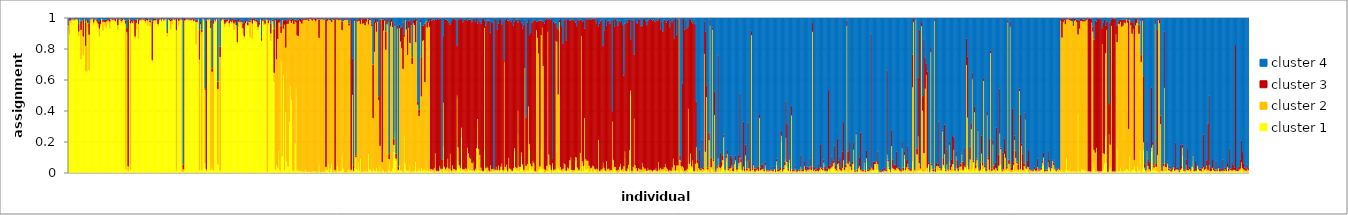
| Category | cluster 1 | cluster 2 | cluster 3 | cluster 4 |
|---|---|---|---|---|
| 0 | 0.914 | 0.038 | 0.013 | 0.035 |
| 1 | 0.891 | 0.092 | 0.009 | 0.009 |
| 2 | 0.964 | 0.019 | 0.009 | 0.009 |
| 3 | 0.982 | 0.007 | 0.005 | 0.005 |
| 4 | 0.982 | 0.01 | 0.004 | 0.004 |
| 5 | 0.982 | 0.006 | 0.006 | 0.006 |
| 6 | 0.981 | 0.009 | 0.006 | 0.004 |
| 7 | 0.987 | 0.004 | 0.005 | 0.004 |
| 8 | 0.982 | 0.009 | 0.005 | 0.004 |
| 9 | 0.882 | 0.029 | 0.049 | 0.04 |
| 10 | 0.984 | 0.007 | 0.005 | 0.004 |
| 11 | 0.731 | 0.19 | 0.058 | 0.021 |
| 12 | 0.973 | 0.012 | 0.007 | 0.009 |
| 13 | 0.757 | 0.122 | 0.106 | 0.015 |
| 14 | 0.976 | 0.016 | 0.003 | 0.005 |
| 15 | 0.658 | 0.161 | 0.15 | 0.032 |
| 16 | 0.651 | 0.332 | 0.008 | 0.01 |
| 17 | 0.934 | 0.032 | 0.026 | 0.008 |
| 18 | 0.659 | 0.231 | 0.075 | 0.035 |
| 19 | 0.961 | 0.03 | 0.005 | 0.005 |
| 20 | 0.984 | 0.007 | 0.004 | 0.004 |
| 21 | 0.983 | 0.01 | 0.004 | 0.003 |
| 22 | 0.955 | 0.015 | 0.017 | 0.012 |
| 23 | 0.98 | 0.007 | 0.008 | 0.006 |
| 24 | 0.986 | 0.007 | 0.004 | 0.003 |
| 25 | 0.966 | 0.01 | 0.016 | 0.008 |
| 26 | 0.938 | 0.024 | 0.017 | 0.021 |
| 27 | 0.879 | 0.05 | 0.047 | 0.024 |
| 28 | 0.944 | 0.017 | 0.025 | 0.014 |
| 29 | 0.988 | 0.005 | 0.004 | 0.003 |
| 30 | 0.916 | 0.058 | 0.011 | 0.015 |
| 31 | 0.965 | 0.009 | 0.011 | 0.015 |
| 32 | 0.947 | 0.024 | 0.017 | 0.012 |
| 33 | 0.934 | 0.044 | 0.009 | 0.013 |
| 34 | 0.97 | 0.013 | 0.008 | 0.009 |
| 35 | 0.97 | 0.013 | 0.008 | 0.009 |
| 36 | 0.929 | 0.047 | 0.015 | 0.009 |
| 37 | 0.988 | 0.005 | 0.004 | 0.003 |
| 38 | 0.974 | 0.014 | 0.008 | 0.004 |
| 39 | 0.98 | 0.008 | 0.006 | 0.005 |
| 40 | 0.98 | 0.008 | 0.007 | 0.005 |
| 41 | 0.971 | 0.009 | 0.012 | 0.007 |
| 42 | 0.987 | 0.006 | 0.004 | 0.003 |
| 43 | 0.922 | 0.029 | 0.042 | 0.008 |
| 44 | 0.984 | 0.005 | 0.006 | 0.006 |
| 45 | 0.984 | 0.007 | 0.005 | 0.004 |
| 46 | 0.965 | 0.013 | 0.011 | 0.011 |
| 47 | 0.972 | 0.012 | 0.011 | 0.005 |
| 48 | 0.986 | 0.006 | 0.004 | 0.003 |
| 49 | 0.974 | 0.013 | 0.009 | 0.004 |
| 50 | 0.02 | 0.941 | 0.021 | 0.018 |
| 51 | 0.887 | 0.019 | 0.028 | 0.066 |
| 52 | 0.01 | 0.03 | 0.95 | 0.01 |
| 53 | 0.984 | 0.008 | 0.004 | 0.004 |
| 54 | 0.02 | 0.944 | 0.017 | 0.019 |
| 55 | 0.967 | 0.009 | 0.013 | 0.012 |
| 56 | 0.959 | 0.008 | 0.011 | 0.022 |
| 57 | 0.975 | 0.006 | 0.013 | 0.006 |
| 58 | 0.866 | 0.013 | 0.11 | 0.012 |
| 59 | 0.926 | 0.04 | 0.02 | 0.014 |
| 60 | 0.986 | 0.004 | 0.004 | 0.006 |
| 61 | 0.862 | 0.097 | 0.028 | 0.014 |
| 62 | 0.98 | 0.006 | 0.009 | 0.005 |
| 63 | 0.977 | 0.01 | 0.01 | 0.003 |
| 64 | 0.984 | 0.005 | 0.004 | 0.006 |
| 65 | 0.983 | 0.006 | 0.006 | 0.006 |
| 66 | 0.979 | 0.01 | 0.006 | 0.006 |
| 67 | 0.964 | 0.015 | 0.011 | 0.01 |
| 68 | 0.982 | 0.005 | 0.007 | 0.006 |
| 69 | 0.948 | 0.034 | 0.011 | 0.007 |
| 70 | 0.985 | 0.005 | 0.005 | 0.004 |
| 71 | 0.944 | 0.026 | 0.013 | 0.017 |
| 72 | 0.98 | 0.01 | 0.005 | 0.005 |
| 73 | 0.714 | 0.013 | 0.25 | 0.024 |
| 74 | 0.966 | 0.017 | 0.012 | 0.005 |
| 75 | 0.978 | 0.007 | 0.009 | 0.007 |
| 76 | 0.974 | 0.011 | 0.009 | 0.006 |
| 77 | 0.979 | 0.011 | 0.005 | 0.004 |
| 78 | 0.945 | 0.013 | 0.037 | 0.005 |
| 79 | 0.979 | 0.01 | 0.005 | 0.006 |
| 80 | 0.984 | 0.008 | 0.004 | 0.004 |
| 81 | 0.977 | 0.006 | 0.007 | 0.01 |
| 82 | 0.989 | 0.005 | 0.004 | 0.003 |
| 83 | 0.977 | 0.009 | 0.009 | 0.005 |
| 84 | 0.983 | 0.007 | 0.005 | 0.005 |
| 85 | 0.987 | 0.005 | 0.004 | 0.004 |
| 86 | 0.877 | 0.024 | 0.013 | 0.086 |
| 87 | 0.985 | 0.005 | 0.006 | 0.005 |
| 88 | 0.977 | 0.009 | 0.009 | 0.005 |
| 89 | 0.924 | 0.053 | 0.011 | 0.012 |
| 90 | 0.958 | 0.024 | 0.013 | 0.005 |
| 91 | 0.987 | 0.004 | 0.005 | 0.004 |
| 92 | 0.982 | 0.007 | 0.006 | 0.005 |
| 93 | 0.983 | 0.007 | 0.005 | 0.005 |
| 94 | 0.013 | 0.907 | 0.074 | 0.006 |
| 95 | 0.986 | 0.004 | 0.005 | 0.005 |
| 96 | 0.95 | 0.03 | 0.013 | 0.008 |
| 97 | 0.981 | 0.007 | 0.006 | 0.006 |
| 98 | 0.986 | 0.005 | 0.005 | 0.004 |
| 99 | 0.008 | 0.978 | 0.011 | 0.004 |
| 100 | 0.007 | 0.015 | 0.03 | 0.948 |
| 101 | 0.02 | 0.963 | 0.013 | 0.005 |
| 102 | 0.981 | 0.006 | 0.007 | 0.006 |
| 103 | 0.985 | 0.006 | 0.005 | 0.004 |
| 104 | 0.982 | 0.007 | 0.006 | 0.005 |
| 105 | 0.982 | 0.005 | 0.005 | 0.007 |
| 106 | 0.98 | 0.008 | 0.007 | 0.005 |
| 107 | 0.978 | 0.009 | 0.006 | 0.006 |
| 108 | 0.983 | 0.007 | 0.006 | 0.004 |
| 109 | 0.972 | 0.008 | 0.013 | 0.008 |
| 110 | 0.981 | 0.008 | 0.006 | 0.005 |
| 111 | 0.828 | 0.145 | 0.015 | 0.013 |
| 112 | 0.966 | 0.008 | 0.009 | 0.016 |
| 113 | 0.988 | 0.004 | 0.003 | 0.004 |
| 114 | 0.015 | 0.715 | 0.19 | 0.08 |
| 115 | 0.891 | 0.069 | 0.013 | 0.026 |
| 116 | 0.015 | 0.893 | 0.015 | 0.078 |
| 117 | 0.99 | 0.004 | 0.003 | 0.003 |
| 118 | 0.98 | 0.009 | 0.008 | 0.004 |
| 119 | 0.061 | 0.474 | 0.01 | 0.456 |
| 120 | 0.009 | 0.012 | 0.961 | 0.017 |
| 121 | 0.983 | 0.007 | 0.006 | 0.004 |
| 122 | 0.982 | 0.007 | 0.005 | 0.007 |
| 123 | 0.987 | 0.004 | 0.004 | 0.005 |
| 124 | 0.019 | 0.914 | 0.052 | 0.015 |
| 125 | 0.034 | 0.617 | 0.022 | 0.327 |
| 126 | 0.016 | 0.946 | 0.028 | 0.01 |
| 127 | 0.974 | 0.014 | 0.007 | 0.005 |
| 128 | 0.968 | 0.014 | 0.007 | 0.011 |
| 129 | 0.987 | 0.005 | 0.005 | 0.003 |
| 130 | 0.052 | 0.487 | 0.049 | 0.411 |
| 131 | 0.594 | 0.396 | 0.005 | 0.005 |
| 132 | 0.013 | 0.733 | 0.069 | 0.185 |
| 133 | 0.977 | 0.009 | 0.009 | 0.005 |
| 134 | 0.987 | 0.003 | 0.005 | 0.005 |
| 135 | 0.978 | 0.012 | 0.006 | 0.004 |
| 136 | 0.941 | 0.02 | 0.028 | 0.011 |
| 137 | 0.963 | 0.01 | 0.017 | 0.011 |
| 138 | 0.97 | 0.009 | 0.013 | 0.009 |
| 139 | 0.984 | 0.006 | 0.006 | 0.005 |
| 140 | 0.941 | 0.023 | 0.02 | 0.016 |
| 141 | 0.971 | 0.009 | 0.011 | 0.009 |
| 142 | 0.963 | 0.01 | 0.011 | 0.017 |
| 143 | 0.97 | 0.012 | 0.012 | 0.007 |
| 144 | 0.921 | 0.042 | 0.027 | 0.01 |
| 145 | 0.967 | 0.008 | 0.016 | 0.01 |
| 146 | 0.929 | 0.022 | 0.038 | 0.011 |
| 147 | 0.832 | 0.01 | 0.097 | 0.061 |
| 148 | 0.942 | 0.033 | 0.019 | 0.006 |
| 149 | 0.965 | 0.01 | 0.007 | 0.018 |
| 150 | 0.954 | 0.018 | 0.007 | 0.021 |
| 151 | 0.933 | 0.039 | 0.017 | 0.011 |
| 152 | 0.891 | 0.04 | 0.034 | 0.035 |
| 153 | 0.871 | 0.009 | 0.088 | 0.033 |
| 154 | 0.96 | 0.004 | 0.02 | 0.015 |
| 155 | 0.96 | 0.02 | 0.011 | 0.01 |
| 156 | 0.945 | 0.007 | 0.018 | 0.03 |
| 157 | 0.966 | 0.006 | 0.008 | 0.02 |
| 158 | 0.873 | 0.101 | 0.008 | 0.019 |
| 159 | 0.981 | 0.006 | 0.007 | 0.006 |
| 160 | 0.866 | 0.096 | 0.031 | 0.007 |
| 161 | 0.98 | 0.006 | 0.007 | 0.007 |
| 162 | 0.975 | 0.007 | 0.01 | 0.007 |
| 163 | 0.962 | 0.018 | 0.007 | 0.014 |
| 164 | 0.965 | 0.009 | 0.017 | 0.009 |
| 165 | 0.919 | 0.02 | 0.041 | 0.021 |
| 166 | 0.948 | 0.008 | 0.013 | 0.031 |
| 167 | 0.984 | 0.007 | 0.005 | 0.004 |
| 168 | 0.845 | 0.008 | 0.019 | 0.127 |
| 169 | 0.974 | 0.008 | 0.009 | 0.009 |
| 170 | 0.953 | 0.027 | 0.006 | 0.013 |
| 171 | 0.953 | 0.009 | 0.022 | 0.017 |
| 172 | 0.986 | 0.004 | 0.005 | 0.005 |
| 173 | 0.006 | 0.979 | 0.006 | 0.008 |
| 174 | 0.953 | 0.013 | 0.014 | 0.02 |
| 175 | 0.976 | 0.01 | 0.006 | 0.007 |
| 176 | 0.85 | 0.048 | 0.064 | 0.039 |
| 177 | 0.978 | 0.005 | 0.008 | 0.008 |
| 178 | 0.962 | 0.015 | 0.01 | 0.013 |
| 179 | 0.586 | 0.059 | 0.283 | 0.072 |
| 180 | 0.017 | 0.968 | 0.009 | 0.007 |
| 181 | 0.047 | 0.686 | 0.258 | 0.008 |
| 182 | 0.032 | 0.831 | 0.123 | 0.014 |
| 183 | 0.142 | 0.825 | 0.026 | 0.007 |
| 184 | 0.013 | 0.96 | 0.021 | 0.006 |
| 185 | 0.719 | 0.182 | 0.046 | 0.052 |
| 186 | 0.105 | 0.881 | 0.007 | 0.007 |
| 187 | 0.632 | 0.297 | 0.053 | 0.019 |
| 188 | 0.015 | 0.941 | 0.029 | 0.015 |
| 189 | 0.394 | 0.413 | 0.183 | 0.009 |
| 190 | 0.071 | 0.888 | 0.02 | 0.021 |
| 191 | 0.038 | 0.923 | 0.032 | 0.008 |
| 192 | 0.326 | 0.663 | 0.007 | 0.004 |
| 193 | 0.555 | 0.425 | 0.01 | 0.01 |
| 194 | 0.467 | 0.5 | 0.02 | 0.013 |
| 195 | 0.013 | 0.969 | 0.011 | 0.006 |
| 196 | 0.012 | 0.948 | 0.031 | 0.009 |
| 197 | 0.188 | 0.792 | 0.008 | 0.012 |
| 198 | 0.542 | 0.428 | 0.016 | 0.014 |
| 199 | 0.013 | 0.872 | 0.096 | 0.019 |
| 200 | 0.018 | 0.864 | 0.107 | 0.012 |
| 201 | 0.009 | 0.973 | 0.012 | 0.005 |
| 202 | 0.01 | 0.964 | 0.021 | 0.005 |
| 203 | 0.009 | 0.953 | 0.026 | 0.012 |
| 204 | 0.008 | 0.976 | 0.01 | 0.006 |
| 205 | 0.006 | 0.982 | 0.007 | 0.004 |
| 206 | 0.019 | 0.965 | 0.008 | 0.007 |
| 207 | 0.008 | 0.98 | 0.008 | 0.004 |
| 208 | 0.007 | 0.982 | 0.007 | 0.005 |
| 209 | 0.006 | 0.974 | 0.011 | 0.009 |
| 210 | 0.006 | 0.985 | 0.005 | 0.005 |
| 211 | 0.004 | 0.988 | 0.006 | 0.003 |
| 212 | 0.007 | 0.975 | 0.013 | 0.005 |
| 213 | 0.014 | 0.976 | 0.006 | 0.004 |
| 214 | 0.007 | 0.981 | 0.006 | 0.006 |
| 215 | 0.009 | 0.968 | 0.019 | 0.004 |
| 216 | 0.004 | 0.983 | 0.008 | 0.004 |
| 217 | 0.007 | 0.983 | 0.006 | 0.004 |
| 218 | 0.051 | 0.819 | 0.119 | 0.012 |
| 219 | 0.005 | 0.984 | 0.006 | 0.004 |
| 220 | 0.004 | 0.986 | 0.006 | 0.005 |
| 221 | 0.008 | 0.983 | 0.005 | 0.003 |
| 222 | 0.006 | 0.982 | 0.006 | 0.006 |
| 223 | 0.006 | 0.982 | 0.006 | 0.006 |
| 224 | 0.022 | 0.015 | 0.952 | 0.011 |
| 225 | 0.016 | 0.964 | 0.014 | 0.006 |
| 226 | 0.054 | 0.934 | 0.005 | 0.007 |
| 227 | 0.004 | 0.983 | 0.008 | 0.004 |
| 228 | 0.027 | 0.956 | 0.009 | 0.008 |
| 229 | 0.057 | 0.915 | 0.014 | 0.014 |
| 230 | 0.004 | 0.985 | 0.007 | 0.004 |
| 231 | 0.009 | 0.976 | 0.008 | 0.007 |
| 232 | 0.006 | 0.012 | 0.973 | 0.009 |
| 233 | 0.005 | 0.984 | 0.007 | 0.004 |
| 234 | 0.043 | 0.946 | 0.007 | 0.005 |
| 235 | 0.009 | 0.977 | 0.007 | 0.006 |
| 236 | 0.006 | 0.98 | 0.008 | 0.006 |
| 237 | 0.012 | 0.976 | 0.007 | 0.005 |
| 238 | 0.109 | 0.811 | 0.056 | 0.025 |
| 239 | 0.027 | 0.954 | 0.01 | 0.01 |
| 240 | 0.005 | 0.982 | 0.008 | 0.005 |
| 241 | 0.005 | 0.982 | 0.007 | 0.006 |
| 242 | 0.004 | 0.984 | 0.007 | 0.005 |
| 243 | 0.014 | 0.971 | 0.007 | 0.007 |
| 244 | 0.02 | 0.93 | 0.013 | 0.037 |
| 245 | 0.007 | 0.979 | 0.008 | 0.006 |
| 246 | 0.008 | 0.011 | 0.974 | 0.007 |
| 247 | 0.023 | 0.48 | 0.235 | 0.261 |
| 248 | 0.006 | 0.007 | 0.034 | 0.953 |
| 249 | 0.03 | 0.95 | 0.013 | 0.007 |
| 250 | 0.09 | 0.012 | 0.01 | 0.888 |
| 251 | 0.018 | 0.958 | 0.015 | 0.009 |
| 252 | 0.068 | 0.913 | 0.011 | 0.008 |
| 253 | 0.013 | 0.968 | 0.012 | 0.007 |
| 254 | 0.093 | 0.866 | 0.032 | 0.009 |
| 255 | 0.006 | 0.982 | 0.008 | 0.004 |
| 256 | 0.006 | 0.955 | 0.029 | 0.01 |
| 257 | 0.011 | 0.954 | 0.029 | 0.006 |
| 258 | 0.008 | 0.943 | 0.045 | 0.005 |
| 259 | 0.009 | 0.967 | 0.019 | 0.005 |
| 260 | 0.006 | 0.986 | 0.004 | 0.004 |
| 261 | 0.121 | 0.836 | 0.032 | 0.011 |
| 262 | 0.017 | 0.969 | 0.009 | 0.005 |
| 263 | 0.02 | 0.966 | 0.009 | 0.004 |
| 264 | 0.008 | 0.937 | 0.014 | 0.041 |
| 265 | 0.025 | 0.327 | 0.346 | 0.302 |
| 266 | 0.015 | 0.766 | 0.197 | 0.022 |
| 267 | 0.009 | 0.959 | 0.025 | 0.006 |
| 268 | 0.032 | 0.878 | 0.061 | 0.028 |
| 269 | 0.011 | 0.963 | 0.02 | 0.005 |
| 270 | 0.006 | 0.462 | 0.022 | 0.51 |
| 271 | 0.042 | 0.131 | 0.816 | 0.011 |
| 272 | 0.006 | 0.984 | 0.006 | 0.004 |
| 273 | 0.016 | 0.052 | 0.922 | 0.011 |
| 274 | 0.014 | 0.903 | 0.071 | 0.011 |
| 275 | 0.005 | 0.977 | 0.011 | 0.006 |
| 276 | 0.008 | 0.786 | 0.117 | 0.089 |
| 277 | 0.005 | 0.952 | 0.035 | 0.008 |
| 278 | 0.017 | 0.956 | 0.019 | 0.008 |
| 279 | 0.077 | 0.011 | 0.032 | 0.88 |
| 280 | 0.008 | 0.937 | 0.046 | 0.009 |
| 281 | 0.009 | 0.966 | 0.019 | 0.007 |
| 282 | 0.028 | 0.912 | 0.032 | 0.028 |
| 283 | 0.132 | 0.047 | 0.043 | 0.778 |
| 284 | 0.257 | 0.691 | 0.018 | 0.034 |
| 285 | 0.076 | 0.015 | 0.032 | 0.877 |
| 286 | 0.01 | 0.92 | 0.02 | 0.05 |
| 287 | 0.014 | 0.005 | 0.021 | 0.961 |
| 288 | 0.045 | 0.888 | 0.022 | 0.045 |
| 289 | 0.014 | 0.832 | 0.088 | 0.067 |
| 290 | 0.014 | 0.79 | 0.139 | 0.056 |
| 291 | 0.005 | 0.665 | 0.3 | 0.029 |
| 292 | 0.238 | 0.641 | 0.011 | 0.11 |
| 293 | 0.059 | 0.926 | 0.009 | 0.006 |
| 294 | 0.015 | 0.909 | 0.058 | 0.017 |
| 295 | 0.011 | 0.749 | 0.165 | 0.076 |
| 296 | 0.012 | 0.923 | 0.049 | 0.016 |
| 297 | 0.044 | 0.792 | 0.141 | 0.023 |
| 298 | 0.005 | 0.947 | 0.042 | 0.006 |
| 299 | 0.012 | 0.689 | 0.042 | 0.256 |
| 300 | 0.006 | 0.959 | 0.019 | 0.016 |
| 301 | 0.013 | 0.94 | 0.035 | 0.012 |
| 302 | 0.071 | 0.771 | 0.15 | 0.008 |
| 303 | 0.008 | 0.973 | 0.012 | 0.006 |
| 304 | 0.014 | 0.425 | 0.023 | 0.538 |
| 305 | 0.027 | 0.339 | 0.04 | 0.594 |
| 306 | 0.009 | 0.962 | 0.02 | 0.01 |
| 307 | 0.031 | 0.462 | 0.253 | 0.254 |
| 308 | 0.015 | 0.836 | 0.098 | 0.052 |
| 309 | 0.015 | 0.84 | 0.093 | 0.052 |
| 310 | 0.023 | 0.561 | 0.378 | 0.039 |
| 311 | 0.012 | 0.968 | 0.011 | 0.008 |
| 312 | 0.029 | 0.908 | 0.037 | 0.025 |
| 313 | 0.008 | 0.961 | 0.024 | 0.007 |
| 314 | 0.016 | 0.925 | 0.033 | 0.027 |
| 315 | 0.012 | 0.012 | 0.971 | 0.006 |
| 316 | 0.01 | 0.013 | 0.959 | 0.018 |
| 317 | 0.009 | 0.011 | 0.97 | 0.011 |
| 318 | 0.005 | 0.024 | 0.955 | 0.015 |
| 319 | 0.053 | 0.073 | 0.866 | 0.008 |
| 320 | 0.007 | 0.006 | 0.975 | 0.012 |
| 321 | 0.007 | 0.007 | 0.982 | 0.005 |
| 322 | 0.006 | 0.004 | 0.979 | 0.011 |
| 323 | 0.033 | 0.01 | 0.95 | 0.007 |
| 324 | 0.017 | 0.007 | 0.97 | 0.007 |
| 325 | 0.005 | 0.021 | 0.059 | 0.914 |
| 326 | 0.17 | 0.282 | 0.43 | 0.119 |
| 327 | 0.029 | 0.01 | 0.954 | 0.007 |
| 328 | 0.012 | 0.012 | 0.965 | 0.011 |
| 329 | 0.008 | 0.025 | 0.955 | 0.013 |
| 330 | 0.039 | 0.051 | 0.892 | 0.019 |
| 331 | 0.005 | 0.021 | 0.941 | 0.032 |
| 332 | 0.069 | 0.053 | 0.833 | 0.045 |
| 333 | 0.004 | 0.01 | 0.964 | 0.022 |
| 334 | 0.009 | 0.039 | 0.942 | 0.01 |
| 335 | 0.013 | 0.012 | 0.969 | 0.007 |
| 336 | 0.012 | 0.011 | 0.969 | 0.008 |
| 337 | 0.006 | 0.011 | 0.97 | 0.013 |
| 338 | 0.476 | 0.022 | 0.323 | 0.179 |
| 339 | 0.075 | 0.088 | 0.828 | 0.01 |
| 340 | 0.025 | 0.023 | 0.943 | 0.009 |
| 341 | 0.012 | 0.021 | 0.958 | 0.009 |
| 342 | 0.228 | 0.063 | 0.703 | 0.007 |
| 343 | 0.015 | 0.008 | 0.95 | 0.026 |
| 344 | 0.016 | 0.006 | 0.97 | 0.008 |
| 345 | 0.007 | 0.024 | 0.956 | 0.013 |
| 346 | 0.01 | 0.016 | 0.968 | 0.006 |
| 347 | 0.012 | 0.15 | 0.819 | 0.019 |
| 348 | 0.026 | 0.099 | 0.862 | 0.013 |
| 349 | 0.015 | 0.082 | 0.893 | 0.009 |
| 350 | 0.015 | 0.074 | 0.898 | 0.013 |
| 351 | 0.011 | 0.051 | 0.91 | 0.028 |
| 352 | 0.014 | 0.056 | 0.923 | 0.007 |
| 353 | 0.006 | 0.009 | 0.977 | 0.008 |
| 354 | 0.014 | 0.012 | 0.947 | 0.027 |
| 355 | 0.014 | 0.144 | 0.835 | 0.008 |
| 356 | 0.181 | 0.164 | 0.619 | 0.036 |
| 357 | 0.016 | 0.136 | 0.842 | 0.006 |
| 358 | 0.01 | 0.104 | 0.863 | 0.024 |
| 359 | 0.013 | 0.019 | 0.929 | 0.038 |
| 360 | 0.006 | 0.008 | 0.98 | 0.006 |
| 361 | 0.006 | 0.006 | 0.982 | 0.006 |
| 362 | 0.149 | 0.786 | 0.046 | 0.019 |
| 363 | 0.015 | 0.016 | 0.917 | 0.053 |
| 364 | 0.004 | 0.036 | 0.939 | 0.021 |
| 365 | 0.014 | 0.017 | 0.951 | 0.018 |
| 366 | 0.004 | 0.008 | 0.971 | 0.018 |
| 367 | 0.006 | 0.042 | 0.854 | 0.097 |
| 368 | 0.007 | 0.015 | 0.952 | 0.026 |
| 369 | 0.007 | 0.017 | 0.947 | 0.029 |
| 370 | 0.009 | 0.013 | 0.005 | 0.974 |
| 371 | 0.01 | 0.01 | 0.975 | 0.005 |
| 372 | 0.018 | 0.02 | 0.953 | 0.008 |
| 373 | 0.009 | 0.009 | 0.904 | 0.079 |
| 374 | 0.022 | 0.025 | 0.914 | 0.04 |
| 375 | 0.007 | 0.009 | 0.969 | 0.015 |
| 376 | 0.016 | 0.023 | 0.954 | 0.007 |
| 377 | 0.045 | 0.015 | 0.898 | 0.042 |
| 378 | 0.005 | 0.011 | 0.969 | 0.015 |
| 379 | 0.011 | 0.705 | 0.009 | 0.275 |
| 380 | 0.018 | 0.019 | 0.952 | 0.011 |
| 381 | 0.019 | 0.034 | 0.94 | 0.007 |
| 382 | 0.004 | 0.008 | 0.969 | 0.019 |
| 383 | 0.023 | 0.072 | 0.884 | 0.02 |
| 384 | 0.022 | 0.006 | 0.962 | 0.009 |
| 385 | 0.007 | 0.014 | 0.955 | 0.024 |
| 386 | 0.006 | 0.007 | 0.978 | 0.008 |
| 387 | 0.016 | 0.014 | 0.918 | 0.052 |
| 388 | 0.138 | 0.02 | 0.817 | 0.026 |
| 389 | 0.022 | 0.013 | 0.955 | 0.01 |
| 390 | 0.011 | 0.02 | 0.956 | 0.012 |
| 391 | 0.247 | 0.154 | 0.568 | 0.03 |
| 392 | 0.011 | 0.028 | 0.953 | 0.008 |
| 393 | 0.025 | 0.014 | 0.947 | 0.013 |
| 394 | 0.107 | 0.025 | 0.834 | 0.035 |
| 395 | 0.043 | 0.012 | 0.874 | 0.071 |
| 396 | 0.006 | 0.013 | 0.934 | 0.047 |
| 397 | 0.008 | 0.667 | 0.313 | 0.012 |
| 398 | 0.019 | 0.025 | 0.314 | 0.642 |
| 399 | 0.013 | 0.043 | 0.912 | 0.033 |
| 400 | 0.014 | 0.414 | 0.564 | 0.008 |
| 401 | 0.147 | 0.039 | 0.702 | 0.112 |
| 402 | 0.038 | 0.021 | 0.843 | 0.098 |
| 403 | 0.017 | 0.024 | 0.929 | 0.031 |
| 404 | 0.064 | 0.012 | 0.902 | 0.022 |
| 405 | 0.007 | 0.056 | 0.923 | 0.014 |
| 406 | 0.005 | 0.006 | 0.974 | 0.015 |
| 407 | 0.005 | 0.914 | 0.057 | 0.024 |
| 408 | 0.005 | 0.866 | 0.104 | 0.025 |
| 409 | 0.018 | 0.752 | 0.213 | 0.017 |
| 410 | 0.025 | 0.015 | 0.942 | 0.017 |
| 411 | 0.153 | 0.734 | 0.096 | 0.017 |
| 412 | 0.024 | 0.913 | 0.04 | 0.022 |
| 413 | 0.025 | 0.662 | 0.292 | 0.02 |
| 414 | 0.003 | 0.021 | 0.938 | 0.038 |
| 415 | 0.005 | 0.012 | 0.971 | 0.013 |
| 416 | 0.01 | 0.035 | 0.949 | 0.006 |
| 417 | 0.01 | 0.899 | 0.082 | 0.009 |
| 418 | 0.054 | 0.063 | 0.877 | 0.007 |
| 419 | 0.035 | 0.014 | 0.938 | 0.013 |
| 420 | 0.004 | 0.014 | 0.974 | 0.008 |
| 421 | 0.046 | 0.016 | 0.027 | 0.911 |
| 422 | 0.012 | 0.007 | 0.956 | 0.025 |
| 423 | 0.012 | 0.009 | 0.945 | 0.033 |
| 424 | 0.021 | 0.829 | 0.117 | 0.033 |
| 425 | 0.042 | 0.803 | 0.094 | 0.06 |
| 426 | 0.027 | 0.478 | 0.416 | 0.079 |
| 427 | 0.017 | 0.955 | 0.016 | 0.012 |
| 428 | 0.017 | 0.019 | 0.956 | 0.008 |
| 429 | 0.008 | 0.011 | 0.928 | 0.053 |
| 430 | 0.007 | 0.019 | 0.809 | 0.165 |
| 431 | 0.013 | 0.048 | 0.923 | 0.017 |
| 432 | 0.018 | 0.036 | 0.939 | 0.007 |
| 433 | 0.006 | 0.007 | 0.842 | 0.145 |
| 434 | 0.017 | 0.017 | 0.957 | 0.008 |
| 435 | 0.013 | 0.015 | 0.963 | 0.009 |
| 436 | 0.05 | 0.03 | 0.902 | 0.018 |
| 437 | 0.018 | 0.08 | 0.888 | 0.013 |
| 438 | 0.005 | 0.012 | 0.973 | 0.01 |
| 439 | 0.007 | 0.009 | 0.968 | 0.016 |
| 440 | 0.008 | 0.01 | 0.967 | 0.016 |
| 441 | 0.072 | 0.029 | 0.868 | 0.032 |
| 442 | 0.037 | 0.061 | 0.848 | 0.054 |
| 443 | 0.012 | 0.021 | 0.959 | 0.007 |
| 444 | 0.009 | 0.01 | 0.964 | 0.017 |
| 445 | 0.028 | 0.1 | 0.863 | 0.009 |
| 446 | 0.007 | 0.875 | 0.106 | 0.012 |
| 447 | 0.058 | 0.017 | 0.899 | 0.026 |
| 448 | 0.011 | 0.032 | 0.936 | 0.021 |
| 449 | 0.049 | 0.303 | 0.577 | 0.071 |
| 450 | 0.018 | 0.068 | 0.908 | 0.006 |
| 451 | 0.026 | 0.051 | 0.914 | 0.008 |
| 452 | 0.026 | 0.052 | 0.913 | 0.009 |
| 453 | 0.006 | 0.039 | 0.948 | 0.006 |
| 454 | 0.012 | 0.019 | 0.958 | 0.011 |
| 455 | 0.027 | 0.006 | 0.957 | 0.01 |
| 456 | 0.007 | 0.039 | 0.947 | 0.006 |
| 457 | 0.031 | 0.01 | 0.953 | 0.006 |
| 458 | 0.015 | 0.008 | 0.969 | 0.008 |
| 459 | 0.012 | 0.015 | 0.939 | 0.033 |
| 460 | 0.005 | 0.017 | 0.97 | 0.007 |
| 461 | 0.017 | 0.195 | 0.732 | 0.055 |
| 462 | 0.006 | 0.005 | 0.953 | 0.036 |
| 463 | 0.006 | 0.013 | 0.963 | 0.018 |
| 464 | 0.008 | 0.017 | 0.966 | 0.008 |
| 465 | 0.043 | 0.022 | 0.754 | 0.181 |
| 466 | 0.018 | 0.012 | 0.889 | 0.08 |
| 467 | 0.008 | 0.006 | 0.973 | 0.013 |
| 468 | 0.007 | 0.068 | 0.874 | 0.051 |
| 469 | 0.01 | 0.015 | 0.954 | 0.021 |
| 470 | 0.007 | 0.02 | 0.953 | 0.019 |
| 471 | 0.006 | 0.012 | 0.945 | 0.037 |
| 472 | 0.011 | 0.008 | 0.966 | 0.015 |
| 473 | 0.012 | 0.319 | 0.065 | 0.604 |
| 474 | 0.028 | 0.055 | 0.906 | 0.012 |
| 475 | 0.023 | 0.015 | 0.905 | 0.057 |
| 476 | 0.01 | 0.028 | 0.956 | 0.007 |
| 477 | 0.004 | 0.01 | 0.968 | 0.018 |
| 478 | 0.004 | 0.016 | 0.929 | 0.051 |
| 479 | 0.007 | 0.032 | 0.942 | 0.02 |
| 480 | 0.035 | 0.023 | 0.914 | 0.028 |
| 481 | 0.008 | 0.009 | 0.963 | 0.021 |
| 482 | 0.008 | 0.017 | 0.928 | 0.047 |
| 483 | 0.007 | 0.035 | 0.586 | 0.373 |
| 484 | 0.092 | 0.045 | 0.825 | 0.038 |
| 485 | 0.005 | 0.006 | 0.979 | 0.011 |
| 486 | 0.01 | 0.018 | 0.941 | 0.031 |
| 487 | 0.02 | 0.031 | 0.939 | 0.01 |
| 488 | 0.006 | 0.141 | 0.841 | 0.013 |
| 489 | 0.508 | 0.022 | 0.332 | 0.137 |
| 490 | 0.003 | 0.008 | 0.98 | 0.009 |
| 491 | 0.005 | 0.032 | 0.946 | 0.017 |
| 492 | 0.028 | 0.32 | 0.415 | 0.236 |
| 493 | 0.015 | 0.033 | 0.944 | 0.008 |
| 494 | 0.006 | 0.023 | 0.94 | 0.031 |
| 495 | 0.007 | 0.007 | 0.95 | 0.036 |
| 496 | 0.008 | 0.021 | 0.962 | 0.009 |
| 497 | 0.005 | 0.017 | 0.971 | 0.007 |
| 498 | 0.008 | 0.012 | 0.925 | 0.055 |
| 499 | 0.005 | 0.058 | 0.885 | 0.051 |
| 500 | 0.007 | 0.03 | 0.957 | 0.006 |
| 501 | 0.006 | 0.021 | 0.967 | 0.005 |
| 502 | 0.011 | 0.016 | 0.952 | 0.021 |
| 503 | 0.008 | 0.005 | 0.94 | 0.047 |
| 504 | 0.011 | 0.02 | 0.952 | 0.017 |
| 505 | 0.009 | 0.008 | 0.973 | 0.011 |
| 506 | 0.003 | 0.016 | 0.975 | 0.006 |
| 507 | 0.008 | 0.008 | 0.97 | 0.014 |
| 508 | 0.004 | 0.007 | 0.972 | 0.017 |
| 509 | 0.01 | 0.007 | 0.971 | 0.012 |
| 510 | 0.009 | 0.01 | 0.955 | 0.026 |
| 511 | 0.007 | 0.021 | 0.966 | 0.006 |
| 512 | 0.005 | 0.006 | 0.97 | 0.018 |
| 513 | 0.011 | 0.059 | 0.915 | 0.014 |
| 514 | 0.005 | 0.015 | 0.974 | 0.006 |
| 515 | 0.008 | 0.023 | 0.894 | 0.075 |
| 516 | 0.009 | 0.013 | 0.956 | 0.022 |
| 517 | 0.012 | 0.013 | 0.884 | 0.092 |
| 518 | 0.012 | 0.023 | 0.953 | 0.012 |
| 519 | 0.008 | 0.049 | 0.928 | 0.016 |
| 520 | 0.008 | 0.026 | 0.934 | 0.032 |
| 521 | 0.012 | 0.012 | 0.958 | 0.018 |
| 522 | 0.004 | 0.009 | 0.977 | 0.01 |
| 523 | 0.006 | 0.011 | 0.923 | 0.061 |
| 524 | 0.005 | 0.008 | 0.982 | 0.005 |
| 525 | 0.012 | 0.022 | 0.938 | 0.028 |
| 526 | 0.011 | 0.081 | 0.897 | 0.011 |
| 527 | 0.014 | 0.034 | 0.819 | 0.133 |
| 528 | 0.005 | 0.01 | 0.981 | 0.005 |
| 529 | 0.014 | 0.032 | 0.843 | 0.111 |
| 530 | 0.013 | 0.034 | 0.945 | 0.007 |
| 531 | 0.005 | 0.986 | 0.005 | 0.004 |
| 532 | 0.049 | 0.032 | 0.033 | 0.886 |
| 533 | 0.02 | 0.021 | 0.031 | 0.927 |
| 534 | 0.01 | 0.032 | 0.532 | 0.426 |
| 535 | 0.005 | 0.029 | 0.962 | 0.005 |
| 536 | 0.005 | 0.007 | 0.912 | 0.075 |
| 537 | 0.004 | 0.012 | 0.97 | 0.014 |
| 538 | 0.007 | 0.018 | 0.906 | 0.07 |
| 539 | 0.089 | 0.324 | 0.531 | 0.055 |
| 540 | 0.02 | 0.037 | 0.936 | 0.007 |
| 541 | 0.071 | 0.053 | 0.866 | 0.01 |
| 542 | 0.033 | 0.008 | 0.934 | 0.025 |
| 543 | 0.034 | 0.045 | 0.886 | 0.034 |
| 544 | 0.004 | 0.006 | 0.978 | 0.012 |
| 545 | 0.012 | 0.046 | 0.902 | 0.04 |
| 546 | 0.021 | 0.145 | 0.293 | 0.541 |
| 547 | 0.006 | 0.057 | 0.019 | 0.918 |
| 548 | 0.017 | 0.015 | 0.007 | 0.961 |
| 549 | 0.006 | 0.019 | 0.123 | 0.853 |
| 550 | 0.009 | 0.009 | 0.01 | 0.972 |
| 551 | 0.007 | 0.021 | 0.186 | 0.786 |
| 552 | 0.008 | 0.014 | 0.012 | 0.965 |
| 553 | 0.009 | 0.758 | 0.21 | 0.023 |
| 554 | 0.02 | 0.115 | 0.774 | 0.091 |
| 555 | 0.019 | 0.469 | 0.072 | 0.44 |
| 556 | 0.006 | 0.017 | 0.01 | 0.968 |
| 557 | 0.012 | 0.197 | 0.048 | 0.744 |
| 558 | 0.004 | 0.945 | 0.042 | 0.009 |
| 559 | 0.027 | 0.008 | 0.061 | 0.904 |
| 560 | 0.02 | 0.903 | 0.012 | 0.064 |
| 561 | 0.004 | 0.072 | 0.008 | 0.917 |
| 562 | 0.008 | 0.364 | 0.149 | 0.479 |
| 563 | 0.004 | 0.004 | 0.006 | 0.986 |
| 564 | 0.018 | 0.013 | 0.011 | 0.958 |
| 565 | 0.007 | 0.086 | 0.665 | 0.242 |
| 566 | 0.027 | 0.011 | 0.007 | 0.955 |
| 567 | 0.008 | 0.022 | 0.097 | 0.873 |
| 568 | 0.02 | 0.021 | 0.03 | 0.929 |
| 569 | 0.049 | 0.032 | 0.033 | 0.886 |
| 570 | 0.223 | 0.007 | 0.015 | 0.756 |
| 571 | 0.006 | 0.01 | 0.006 | 0.978 |
| 572 | 0.069 | 0.027 | 0.015 | 0.888 |
| 573 | 0.016 | 0.106 | 0.025 | 0.852 |
| 574 | 0.01 | 0.007 | 0.01 | 0.973 |
| 575 | 0.006 | 0.021 | 0.011 | 0.962 |
| 576 | 0.01 | 0.02 | 0.082 | 0.889 |
| 577 | 0.03 | 0.017 | 0.052 | 0.9 |
| 578 | 0.004 | 0.007 | 0.02 | 0.969 |
| 579 | 0.011 | 0.045 | 0.011 | 0.933 |
| 580 | 0.069 | 0.012 | 0.028 | 0.891 |
| 581 | 0.008 | 0.009 | 0.006 | 0.977 |
| 582 | 0.006 | 0.016 | 0.009 | 0.968 |
| 583 | 0.042 | 0.02 | 0.053 | 0.884 |
| 584 | 0.019 | 0.078 | 0.416 | 0.487 |
| 585 | 0.041 | 0.027 | 0.023 | 0.909 |
| 586 | 0.007 | 0.009 | 0.007 | 0.977 |
| 587 | 0.016 | 0.024 | 0.29 | 0.67 |
| 588 | 0.004 | 0.009 | 0.017 | 0.969 |
| 589 | 0.075 | 0.037 | 0.071 | 0.817 |
| 590 | 0.007 | 0.007 | 0.015 | 0.971 |
| 591 | 0.029 | 0.047 | 0.25 | 0.674 |
| 592 | 0.006 | 0.021 | 0.053 | 0.92 |
| 593 | 0.006 | 0.005 | 0.013 | 0.975 |
| 594 | 0.013 | 0.874 | 0.028 | 0.085 |
| 595 | 0.006 | 0.013 | 0.01 | 0.972 |
| 596 | 0.017 | 0.032 | 0.014 | 0.938 |
| 597 | 0.003 | 0.005 | 0.019 | 0.972 |
| 598 | 0.012 | 0.006 | 0.011 | 0.97 |
| 599 | 0.013 | 0.013 | 0.011 | 0.963 |
| 600 | 0.008 | 0.005 | 0.026 | 0.962 |
| 601 | 0.012 | 0.342 | 0.024 | 0.622 |
| 602 | 0.01 | 0.008 | 0.015 | 0.967 |
| 603 | 0.012 | 0.01 | 0.031 | 0.947 |
| 604 | 0.014 | 0.011 | 0.032 | 0.943 |
| 605 | 0.006 | 0.006 | 0.008 | 0.98 |
| 606 | 0.032 | 0.016 | 0.024 | 0.928 |
| 607 | 0.005 | 0.007 | 0.005 | 0.983 |
| 608 | 0.006 | 0.009 | 0.007 | 0.978 |
| 609 | 0.005 | 0.005 | 0.005 | 0.986 |
| 610 | 0.007 | 0.004 | 0.006 | 0.983 |
| 611 | 0.01 | 0.009 | 0.021 | 0.961 |
| 612 | 0.005 | 0.006 | 0.007 | 0.982 |
| 613 | 0.006 | 0.006 | 0.009 | 0.979 |
| 614 | 0.017 | 0.008 | 0.014 | 0.961 |
| 615 | 0.003 | 0.004 | 0.01 | 0.982 |
| 616 | 0.047 | 0.026 | 0.017 | 0.91 |
| 617 | 0.005 | 0.004 | 0.011 | 0.979 |
| 618 | 0.005 | 0.008 | 0.014 | 0.974 |
| 619 | 0.004 | 0.015 | 0.018 | 0.963 |
| 620 | 0.198 | 0.041 | 0.031 | 0.729 |
| 621 | 0.004 | 0.005 | 0.007 | 0.984 |
| 622 | 0.011 | 0.011 | 0.012 | 0.966 |
| 623 | 0.021 | 0.027 | 0.025 | 0.926 |
| 624 | 0.085 | 0.138 | 0.239 | 0.537 |
| 625 | 0.037 | 0.031 | 0.247 | 0.685 |
| 626 | 0.007 | 0.007 | 0.011 | 0.975 |
| 627 | 0.064 | 0.021 | 0.009 | 0.906 |
| 628 | 0.005 | 0.006 | 0.01 | 0.979 |
| 629 | 0.023 | 0.346 | 0.062 | 0.569 |
| 630 | 0.003 | 0.006 | 0.01 | 0.981 |
| 631 | 0.006 | 0.004 | 0.007 | 0.983 |
| 632 | 0.007 | 0.02 | 0.02 | 0.953 |
| 633 | 0.003 | 0.005 | 0.007 | 0.985 |
| 634 | 0.004 | 0.006 | 0.009 | 0.98 |
| 635 | 0.01 | 0.005 | 0.006 | 0.978 |
| 636 | 0.005 | 0.007 | 0.008 | 0.98 |
| 637 | 0.015 | 0.022 | 0.077 | 0.885 |
| 638 | 0.005 | 0.006 | 0.009 | 0.98 |
| 639 | 0.005 | 0.007 | 0.013 | 0.975 |
| 640 | 0.019 | 0.025 | 0.031 | 0.926 |
| 641 | 0.005 | 0.014 | 0.024 | 0.956 |
| 642 | 0.004 | 0.006 | 0.006 | 0.984 |
| 643 | 0.009 | 0.01 | 0.021 | 0.96 |
| 644 | 0.005 | 0.015 | 0.011 | 0.969 |
| 645 | 0.023 | 0.018 | 0.053 | 0.905 |
| 646 | 0.005 | 0.013 | 0.021 | 0.961 |
| 647 | 0.015 | 0.894 | 0.062 | 0.029 |
| 648 | 0.007 | 0.004 | 0.006 | 0.982 |
| 649 | 0.005 | 0.015 | 0.017 | 0.964 |
| 650 | 0.005 | 0.005 | 0.011 | 0.979 |
| 651 | 0.009 | 0.007 | 0.012 | 0.972 |
| 652 | 0.003 | 0.007 | 0.048 | 0.942 |
| 653 | 0.01 | 0.01 | 0.011 | 0.968 |
| 654 | 0.008 | 0.026 | 0.15 | 0.816 |
| 655 | 0.019 | 0.006 | 0.007 | 0.968 |
| 656 | 0.011 | 0.006 | 0.009 | 0.974 |
| 657 | 0.055 | 0.009 | 0.022 | 0.913 |
| 658 | 0.006 | 0.007 | 0.03 | 0.957 |
| 659 | 0.005 | 0.008 | 0.009 | 0.978 |
| 660 | 0.004 | 0.009 | 0.012 | 0.976 |
| 661 | 0.018 | 0.009 | 0.507 | 0.466 |
| 662 | 0.009 | 0.016 | 0.022 | 0.954 |
| 663 | 0.02 | 0.013 | 0.016 | 0.952 |
| 664 | 0.025 | 0.015 | 0.063 | 0.897 |
| 665 | 0.042 | 0.021 | 0.014 | 0.922 |
| 666 | 0.04 | 0.027 | 0.109 | 0.825 |
| 667 | 0.011 | 0.013 | 0.021 | 0.956 |
| 668 | 0.01 | 0.007 | 0.01 | 0.973 |
| 669 | 0.007 | 0.049 | 0.166 | 0.778 |
| 670 | 0.042 | 0.021 | 0.014 | 0.923 |
| 671 | 0.009 | 0.012 | 0.085 | 0.894 |
| 672 | 0.007 | 0.008 | 0.016 | 0.97 |
| 673 | 0.012 | 0.018 | 0.105 | 0.865 |
| 674 | 0.019 | 0.062 | 0.247 | 0.672 |
| 675 | 0.006 | 0.013 | 0.013 | 0.969 |
| 676 | 0.012 | 0.022 | 0.019 | 0.947 |
| 677 | 0.08 | 0.866 | 0.038 | 0.015 |
| 678 | 0.004 | 0.054 | 0.081 | 0.861 |
| 679 | 0.011 | 0.062 | 0.125 | 0.802 |
| 680 | 0.032 | 0.008 | 0.02 | 0.94 |
| 681 | 0.005 | 0.015 | 0.013 | 0.968 |
| 682 | 0.013 | 0.044 | 0.017 | 0.927 |
| 683 | 0.059 | 0.089 | 0.047 | 0.804 |
| 684 | 0.003 | 0.004 | 0.007 | 0.987 |
| 685 | 0.241 | 0.007 | 0.018 | 0.734 |
| 686 | 0.004 | 0.004 | 0.012 | 0.98 |
| 687 | 0.018 | 0.015 | 0.009 | 0.957 |
| 688 | 0.025 | 0.019 | 0.054 | 0.902 |
| 689 | 0.006 | 0.012 | 0.24 | 0.743 |
| 690 | 0.006 | 0.008 | 0.005 | 0.981 |
| 691 | 0.004 | 0.005 | 0.013 | 0.978 |
| 692 | 0.046 | 0.022 | 0.011 | 0.921 |
| 693 | 0.003 | 0.004 | 0.007 | 0.985 |
| 694 | 0.064 | 0.03 | 0.051 | 0.855 |
| 695 | 0.006 | 0.007 | 0.007 | 0.98 |
| 696 | 0.005 | 0.007 | 0.008 | 0.98 |
| 697 | 0.007 | 0.011 | 0.022 | 0.961 |
| 698 | 0.01 | 0.026 | 0.859 | 0.106 |
| 699 | 0.016 | 0.008 | 0.005 | 0.971 |
| 700 | 0.009 | 0.01 | 0.053 | 0.929 |
| 701 | 0.019 | 0.038 | 0.015 | 0.928 |
| 702 | 0.048 | 0.01 | 0.01 | 0.933 |
| 703 | 0.019 | 0.05 | 0.006 | 0.925 |
| 704 | 0.036 | 0.019 | 0.083 | 0.862 |
| 705 | 0.004 | 0.004 | 0.007 | 0.985 |
| 706 | 0.004 | 0.003 | 0.009 | 0.984 |
| 707 | 0.003 | 0.004 | 0.007 | 0.987 |
| 708 | 0.005 | 0.007 | 0.015 | 0.972 |
| 709 | 0.005 | 0.004 | 0.006 | 0.986 |
| 710 | 0.005 | 0.01 | 0.021 | 0.963 |
| 711 | 0.006 | 0.005 | 0.01 | 0.979 |
| 712 | 0.004 | 0.113 | 0.544 | 0.338 |
| 713 | 0.04 | 0.035 | 0.01 | 0.916 |
| 714 | 0.018 | 0.005 | 0.01 | 0.966 |
| 715 | 0.004 | 0.004 | 0.005 | 0.988 |
| 716 | 0.024 | 0.147 | 0.104 | 0.725 |
| 717 | 0.019 | 0.012 | 0.056 | 0.913 |
| 718 | 0.009 | 0.015 | 0.025 | 0.951 |
| 719 | 0.01 | 0.009 | 0.034 | 0.948 |
| 720 | 0.008 | 0.023 | 0.106 | 0.863 |
| 721 | 0.021 | 0.008 | 0.007 | 0.964 |
| 722 | 0.018 | 0.008 | 0.007 | 0.968 |
| 723 | 0.007 | 0.008 | 0.016 | 0.968 |
| 724 | 0.003 | 0.006 | 0.009 | 0.982 |
| 725 | 0.009 | 0.149 | 0.045 | 0.797 |
| 726 | 0.01 | 0.005 | 0.018 | 0.967 |
| 727 | 0.088 | 0.026 | 0.025 | 0.861 |
| 728 | 0.004 | 0.013 | 0.017 | 0.966 |
| 729 | 0.019 | 0.015 | 0.048 | 0.917 |
| 730 | 0.007 | 0.051 | 0.116 | 0.825 |
| 731 | 0.01 | 0.012 | 0.011 | 0.968 |
| 732 | 0.006 | 0.008 | 0.01 | 0.975 |
| 733 | 0.006 | 0.009 | 0.009 | 0.976 |
| 734 | 0.073 | 0.478 | 0.211 | 0.239 |
| 735 | 0.005 | 0.968 | 0.023 | 0.004 |
| 736 | 0.007 | 0.009 | 0.007 | 0.977 |
| 737 | 0.008 | 0.979 | 0.009 | 0.004 |
| 738 | 0.014 | 0.104 | 0.04 | 0.842 |
| 739 | 0.013 | 0.222 | 0.378 | 0.387 |
| 740 | 0.014 | 0.048 | 0.861 | 0.077 |
| 741 | 0.019 | 0.009 | 0.015 | 0.957 |
| 742 | 0.014 | 0.931 | 0.027 | 0.027 |
| 743 | 0.008 | 0.393 | 0.094 | 0.505 |
| 744 | 0.006 | 0.12 | 0.736 | 0.139 |
| 745 | 0.01 | 0.533 | 0.202 | 0.255 |
| 746 | 0.026 | 0.604 | 0.075 | 0.294 |
| 747 | 0.009 | 0.023 | 0.621 | 0.347 |
| 748 | 0.05 | 0.006 | 0.011 | 0.933 |
| 749 | 0.003 | 0.003 | 0.005 | 0.989 |
| 750 | 0.015 | 0.762 | 0.034 | 0.189 |
| 751 | 0.026 | 0.021 | 0.014 | 0.939 |
| 752 | 0.004 | 0.005 | 0.012 | 0.98 |
| 753 | 0.007 | 0.974 | 0.012 | 0.006 |
| 754 | 0.004 | 0.004 | 0.017 | 0.974 |
| 755 | 0.022 | 0.02 | 0.021 | 0.938 |
| 756 | 0.011 | 0.035 | 0.013 | 0.942 |
| 757 | 0.017 | 0.022 | 0.292 | 0.669 |
| 758 | 0.012 | 0.017 | 0.01 | 0.961 |
| 759 | 0.009 | 0.009 | 0.011 | 0.971 |
| 760 | 0.027 | 0.24 | 0.012 | 0.721 |
| 761 | 0.043 | 0.009 | 0.042 | 0.906 |
| 762 | 0.029 | 0.091 | 0.191 | 0.69 |
| 763 | 0.006 | 0.005 | 0.008 | 0.981 |
| 764 | 0.045 | 0.009 | 0.098 | 0.848 |
| 765 | 0.007 | 0.008 | 0.007 | 0.978 |
| 766 | 0.074 | 0.106 | 0.022 | 0.798 |
| 767 | 0.01 | 0.008 | 0.035 | 0.948 |
| 768 | 0.008 | 0.031 | 0.046 | 0.915 |
| 769 | 0.01 | 0.045 | 0.188 | 0.757 |
| 770 | 0.054 | 0.093 | 0.085 | 0.769 |
| 771 | 0.008 | 0.006 | 0.01 | 0.976 |
| 772 | 0.043 | 0.064 | 0.033 | 0.861 |
| 773 | 0.008 | 0.019 | 0.055 | 0.918 |
| 774 | 0.005 | 0.008 | 0.013 | 0.974 |
| 775 | 0.021 | 0.018 | 0.006 | 0.955 |
| 776 | 0.013 | 0.027 | 0.02 | 0.94 |
| 777 | 0.037 | 0.081 | 0.01 | 0.872 |
| 778 | 0.01 | 0.008 | 0.053 | 0.929 |
| 779 | 0.026 | 0.017 | 0.117 | 0.84 |
| 780 | 0.029 | 0.01 | 0.009 | 0.953 |
| 781 | 0.017 | 0.678 | 0.17 | 0.135 |
| 782 | 0.046 | 0.31 | 0.392 | 0.251 |
| 783 | 0.01 | 0.014 | 0.007 | 0.969 |
| 784 | 0.065 | 0.02 | 0.082 | 0.833 |
| 785 | 0.012 | 0.269 | 0.04 | 0.679 |
| 786 | 0.024 | 0.58 | 0.041 | 0.356 |
| 787 | 0.062 | 0.008 | 0.009 | 0.922 |
| 788 | 0.012 | 0.378 | 0.038 | 0.572 |
| 789 | 0.02 | 0.009 | 0.024 | 0.947 |
| 790 | 0.062 | 0.021 | 0.007 | 0.91 |
| 791 | 0.034 | 0.236 | 0.018 | 0.712 |
| 792 | 0.004 | 0.01 | 0.01 | 0.976 |
| 793 | 0.011 | 0.009 | 0.043 | 0.937 |
| 794 | 0.062 | 0.062 | 0.116 | 0.761 |
| 795 | 0.009 | 0.038 | 0.021 | 0.932 |
| 796 | 0.022 | 0.57 | 0.019 | 0.389 |
| 797 | 0.029 | 0.007 | 0.013 | 0.951 |
| 798 | 0.005 | 0.007 | 0.012 | 0.976 |
| 799 | 0.011 | 0.359 | 0.026 | 0.605 |
| 800 | 0.022 | 0.064 | 0.014 | 0.9 |
| 801 | 0.007 | 0.012 | 0.201 | 0.78 |
| 802 | 0.005 | 0.767 | 0.018 | 0.209 |
| 803 | 0.007 | 0.006 | 0.012 | 0.975 |
| 804 | 0.012 | 0.169 | 0.031 | 0.788 |
| 805 | 0.01 | 0.01 | 0.026 | 0.954 |
| 806 | 0.005 | 0.028 | 0.033 | 0.934 |
| 807 | 0.012 | 0.015 | 0.264 | 0.708 |
| 808 | 0.008 | 0.007 | 0.012 | 0.973 |
| 809 | 0.011 | 0.034 | 0.071 | 0.885 |
| 810 | 0.05 | 0.202 | 0.292 | 0.456 |
| 811 | 0.054 | 0.097 | 0.012 | 0.837 |
| 812 | 0.005 | 0.008 | 0.007 | 0.98 |
| 813 | 0.007 | 0.015 | 0.107 | 0.871 |
| 814 | 0.009 | 0.114 | 0.099 | 0.778 |
| 815 | 0.017 | 0.079 | 0.049 | 0.855 |
| 816 | 0.01 | 0.016 | 0.012 | 0.962 |
| 817 | 0.027 | 0.941 | 0.022 | 0.009 |
| 818 | 0.012 | 0.045 | 0.026 | 0.917 |
| 819 | 0.007 | 0.934 | 0.033 | 0.027 |
| 820 | 0.004 | 0.012 | 0.02 | 0.963 |
| 821 | 0.007 | 0.012 | 0.393 | 0.587 |
| 822 | 0.042 | 0.011 | 0.012 | 0.935 |
| 823 | 0.01 | 0.201 | 0.03 | 0.76 |
| 824 | 0.011 | 0.084 | 0.046 | 0.859 |
| 825 | 0.057 | 0.005 | 0.009 | 0.928 |
| 826 | 0.007 | 0.012 | 0.035 | 0.946 |
| 827 | 0.019 | 0.508 | 0.017 | 0.456 |
| 828 | 0.007 | 0.016 | 0.352 | 0.625 |
| 829 | 0.073 | 0.102 | 0.014 | 0.812 |
| 830 | 0.008 | 0.009 | 0.104 | 0.879 |
| 831 | 0.007 | 0.036 | 0.016 | 0.94 |
| 832 | 0.024 | 0.319 | 0.046 | 0.611 |
| 833 | 0.021 | 0.003 | 0.005 | 0.97 |
| 834 | 0.02 | 0.019 | 0.041 | 0.919 |
| 835 | 0.005 | 0.03 | 0.111 | 0.854 |
| 836 | 0.003 | 0.018 | 0.014 | 0.965 |
| 837 | 0.008 | 0.005 | 0.004 | 0.983 |
| 838 | 0.006 | 0.005 | 0.005 | 0.984 |
| 839 | 0.007 | 0.006 | 0.009 | 0.979 |
| 840 | 0.015 | 0.008 | 0.017 | 0.96 |
| 841 | 0.006 | 0.008 | 0.011 | 0.975 |
| 842 | 0.006 | 0.008 | 0.017 | 0.97 |
| 843 | 0.006 | 0.03 | 0.055 | 0.91 |
| 844 | 0.007 | 0.007 | 0.007 | 0.98 |
| 845 | 0.008 | 0.011 | 0.008 | 0.973 |
| 846 | 0.015 | 0.008 | 0.011 | 0.966 |
| 847 | 0.045 | 0.02 | 0.012 | 0.923 |
| 848 | 0.048 | 0.051 | 0.029 | 0.872 |
| 849 | 0.004 | 0.005 | 0.009 | 0.981 |
| 850 | 0.006 | 0.006 | 0.007 | 0.981 |
| 851 | 0.006 | 0.006 | 0.01 | 0.979 |
| 852 | 0.032 | 0.035 | 0.075 | 0.858 |
| 853 | 0.026 | 0.009 | 0.048 | 0.917 |
| 854 | 0.006 | 0.007 | 0.007 | 0.981 |
| 855 | 0.015 | 0.017 | 0.008 | 0.959 |
| 856 | 0.022 | 0.055 | 0.01 | 0.912 |
| 857 | 0.013 | 0.036 | 0.017 | 0.934 |
| 858 | 0.01 | 0.014 | 0.006 | 0.969 |
| 859 | 0.005 | 0.006 | 0.006 | 0.983 |
| 860 | 0.013 | 0.006 | 0.006 | 0.974 |
| 861 | 0.006 | 0.021 | 0.008 | 0.965 |
| 862 | 0.011 | 0.008 | 0.006 | 0.975 |
| 863 | 0.008 | 0.974 | 0.011 | 0.007 |
| 864 | 0.017 | 0.855 | 0.121 | 0.007 |
| 865 | 0.006 | 0.966 | 0.02 | 0.009 |
| 866 | 0.005 | 0.979 | 0.012 | 0.004 |
| 867 | 0.016 | 0.942 | 0.028 | 0.014 |
| 868 | 0.096 | 0.893 | 0.005 | 0.007 |
| 869 | 0.013 | 0.976 | 0.006 | 0.005 |
| 870 | 0.013 | 0.976 | 0.006 | 0.005 |
| 871 | 0.011 | 0.972 | 0.012 | 0.005 |
| 872 | 0.006 | 0.974 | 0.014 | 0.006 |
| 873 | 0.009 | 0.969 | 0.016 | 0.006 |
| 874 | 0.007 | 0.942 | 0.011 | 0.04 |
| 875 | 0.01 | 0.971 | 0.012 | 0.006 |
| 876 | 0.006 | 0.978 | 0.011 | 0.005 |
| 877 | 0.007 | 0.966 | 0.014 | 0.013 |
| 878 | 0.377 | 0.515 | 0.099 | 0.009 |
| 879 | 0.008 | 0.922 | 0.05 | 0.021 |
| 880 | 0.008 | 0.971 | 0.015 | 0.006 |
| 881 | 0.021 | 0.96 | 0.012 | 0.007 |
| 882 | 0.021 | 0.957 | 0.01 | 0.012 |
| 883 | 0.016 | 0.96 | 0.013 | 0.011 |
| 884 | 0.012 | 0.966 | 0.012 | 0.011 |
| 885 | 0.013 | 0.971 | 0.011 | 0.006 |
| 886 | 0.005 | 0.986 | 0.006 | 0.003 |
| 887 | 0.004 | 0.006 | 0.984 | 0.007 |
| 888 | 0.004 | 0.007 | 0.985 | 0.004 |
| 889 | 0.003 | 0.005 | 0.986 | 0.005 |
| 890 | 0.006 | 0.962 | 0.024 | 0.007 |
| 891 | 0.063 | 0.847 | 0.034 | 0.056 |
| 892 | 0.028 | 0.119 | 0.713 | 0.139 |
| 893 | 0.007 | 0.123 | 0.85 | 0.02 |
| 894 | 0.006 | 0.155 | 0.815 | 0.024 |
| 895 | 0.005 | 0.009 | 0.977 | 0.01 |
| 896 | 0.003 | 0.006 | 0.984 | 0.007 |
| 897 | 0.003 | 0.006 | 0.984 | 0.007 |
| 898 | 0.004 | 0.006 | 0.986 | 0.005 |
| 899 | 0.01 | 0.819 | 0.103 | 0.067 |
| 900 | 0.025 | 0.1 | 0.845 | 0.031 |
| 901 | 0.059 | 0.063 | 0.867 | 0.01 |
| 902 | 0.236 | 0.535 | 0.179 | 0.05 |
| 903 | 0.063 | 0.856 | 0.054 | 0.027 |
| 904 | 0.003 | 0.004 | 0.989 | 0.004 |
| 905 | 0.023 | 0.224 | 0.197 | 0.556 |
| 906 | 0.037 | 0.144 | 0.787 | 0.032 |
| 907 | 0.006 | 0.942 | 0.042 | 0.01 |
| 908 | 0.003 | 0.006 | 0.987 | 0.004 |
| 909 | 0.004 | 0.006 | 0.983 | 0.006 |
| 910 | 0.003 | 0.005 | 0.985 | 0.006 |
| 911 | 0.009 | 0.883 | 0.102 | 0.006 |
| 912 | 0.153 | 0.689 | 0.107 | 0.051 |
| 913 | 0.009 | 0.952 | 0.016 | 0.023 |
| 914 | 0.011 | 0.949 | 0.025 | 0.015 |
| 915 | 0.033 | 0.942 | 0.013 | 0.013 |
| 916 | 0.009 | 0.933 | 0.044 | 0.015 |
| 917 | 0.007 | 0.942 | 0.038 | 0.012 |
| 918 | 0.013 | 0.96 | 0.018 | 0.009 |
| 919 | 0.014 | 0.951 | 0.024 | 0.012 |
| 920 | 0.027 | 0.963 | 0.005 | 0.004 |
| 921 | 0.02 | 0.949 | 0.015 | 0.016 |
| 922 | 0.01 | 0.272 | 0.699 | 0.019 |
| 923 | 0.104 | 0.883 | 0.008 | 0.005 |
| 924 | 0.008 | 0.942 | 0.022 | 0.028 |
| 925 | 0.017 | 0.879 | 0.097 | 0.006 |
| 926 | 0.018 | 0.91 | 0.043 | 0.029 |
| 927 | 0.042 | 0.04 | 0.867 | 0.05 |
| 928 | 0.011 | 0.939 | 0.045 | 0.006 |
| 929 | 0.005 | 0.961 | 0.029 | 0.006 |
| 930 | 0.045 | 0.943 | 0.006 | 0.006 |
| 931 | 0.012 | 0.884 | 0.058 | 0.046 |
| 932 | 0.144 | 0.839 | 0.013 | 0.004 |
| 933 | 0.005 | 0.71 | 0.045 | 0.241 |
| 934 | 0.024 | 0.958 | 0.011 | 0.007 |
| 935 | 0.143 | 0.054 | 0.425 | 0.378 |
| 936 | 0.019 | 0.014 | 0.023 | 0.944 |
| 937 | 0.005 | 0.006 | 0.005 | 0.984 |
| 938 | 0.02 | 0.119 | 0.063 | 0.797 |
| 939 | 0.006 | 0.037 | 0.046 | 0.911 |
| 940 | 0.008 | 0.014 | 0.048 | 0.93 |
| 941 | 0.009 | 0.006 | 0.005 | 0.981 |
| 942 | 0.136 | 0.026 | 0.389 | 0.449 |
| 943 | 0.015 | 0.165 | 0.021 | 0.798 |
| 944 | 0.018 | 0.016 | 0.014 | 0.952 |
| 945 | 0.039 | 0.92 | 0.034 | 0.007 |
| 946 | 0.011 | 0.027 | 0.024 | 0.938 |
| 947 | 0.009 | 0.105 | 0.811 | 0.075 |
| 948 | 0.005 | 0.981 | 0.008 | 0.006 |
| 949 | 0.005 | 0.959 | 0.027 | 0.009 |
| 950 | 0.009 | 0.304 | 0.056 | 0.631 |
| 951 | 0.009 | 0.005 | 0.011 | 0.975 |
| 952 | 0.006 | 0.038 | 0.014 | 0.942 |
| 953 | 0.009 | 0.538 | 0.365 | 0.087 |
| 954 | 0.01 | 0.029 | 0.02 | 0.941 |
| 955 | 0.006 | 0.03 | 0.012 | 0.952 |
| 956 | 0.043 | 0.017 | 0.01 | 0.93 |
| 957 | 0.009 | 0.007 | 0.011 | 0.973 |
| 958 | 0.007 | 0.02 | 0.02 | 0.952 |
| 959 | 0.004 | 0.005 | 0.013 | 0.978 |
| 960 | 0.008 | 0.009 | 0.007 | 0.975 |
| 961 | 0.024 | 0.012 | 0.011 | 0.953 |
| 962 | 0.008 | 0.006 | 0.01 | 0.975 |
| 963 | 0.011 | 0.009 | 0.173 | 0.807 |
| 964 | 0.015 | 0.008 | 0.009 | 0.968 |
| 965 | 0.012 | 0.007 | 0.02 | 0.961 |
| 966 | 0.004 | 0.003 | 0.008 | 0.985 |
| 967 | 0.013 | 0.007 | 0.163 | 0.817 |
| 968 | 0.021 | 0.007 | 0.016 | 0.957 |
| 969 | 0.11 | 0.051 | 0.019 | 0.82 |
| 970 | 0.009 | 0.005 | 0.008 | 0.977 |
| 971 | 0.005 | 0.008 | 0.009 | 0.978 |
| 972 | 0.018 | 0.033 | 0.034 | 0.915 |
| 973 | 0.009 | 0.008 | 0.142 | 0.841 |
| 974 | 0.009 | 0.008 | 0.011 | 0.972 |
| 975 | 0.014 | 0.01 | 0.015 | 0.962 |
| 976 | 0.004 | 0.007 | 0.006 | 0.983 |
| 977 | 0.034 | 0.004 | 0.006 | 0.956 |
| 978 | 0.074 | 0.036 | 0.016 | 0.875 |
| 979 | 0.005 | 0.006 | 0.012 | 0.977 |
| 980 | 0.008 | 0.006 | 0.063 | 0.923 |
| 981 | 0.007 | 0.004 | 0.005 | 0.985 |
| 982 | 0.037 | 0.01 | 0.009 | 0.943 |
| 983 | 0.016 | 0.009 | 0.011 | 0.964 |
| 984 | 0.008 | 0.005 | 0.013 | 0.974 |
| 985 | 0.007 | 0.006 | 0.012 | 0.975 |
| 986 | 0.022 | 0.006 | 0.011 | 0.961 |
| 987 | 0.005 | 0.03 | 0.212 | 0.754 |
| 988 | 0.013 | 0.006 | 0.017 | 0.964 |
| 989 | 0.017 | 0.009 | 0.012 | 0.962 |
| 990 | 0.009 | 0.036 | 0.036 | 0.919 |
| 991 | 0.005 | 0.013 | 0.298 | 0.684 |
| 992 | 0.012 | 0.038 | 0.447 | 0.503 |
| 993 | 0.005 | 0.006 | 0.026 | 0.963 |
| 994 | 0.009 | 0.004 | 0.012 | 0.974 |
| 995 | 0.017 | 0.015 | 0.055 | 0.913 |
| 996 | 0.011 | 0.006 | 0.013 | 0.97 |
| 997 | 0.006 | 0.004 | 0.012 | 0.978 |
| 998 | 0.013 | 0.009 | 0.054 | 0.924 |
| 999 | 0.006 | 0.005 | 0.008 | 0.98 |
| 1000 | 0.023 | 0.007 | 0.014 | 0.956 |
| 1001 | 0.005 | 0.006 | 0.017 | 0.972 |
| 1002 | 0.006 | 0.004 | 0.008 | 0.983 |
| 1003 | 0.006 | 0.007 | 0.012 | 0.976 |
| 1004 | 0.005 | 0.009 | 0.071 | 0.915 |
| 1005 | 0.009 | 0.004 | 0.007 | 0.979 |
| 1006 | 0.012 | 0.009 | 0.014 | 0.965 |
| 1007 | 0.007 | 0.004 | 0.012 | 0.976 |
| 1008 | 0.03 | 0.008 | 0.025 | 0.938 |
| 1009 | 0.007 | 0.006 | 0.013 | 0.974 |
| 1010 | 0.01 | 0.015 | 0.129 | 0.846 |
| 1011 | 0.007 | 0.009 | 0.009 | 0.976 |
| 1012 | 0.008 | 0.007 | 0.058 | 0.927 |
| 1013 | 0.009 | 0.01 | 0.032 | 0.949 |
| 1014 | 0.012 | 0.007 | 0.014 | 0.968 |
| 1015 | 0.008 | 0.007 | 0.809 | 0.175 |
| 1016 | 0.008 | 0.005 | 0.008 | 0.979 |
| 1017 | 0.007 | 0.004 | 0.019 | 0.97 |
| 1018 | 0.009 | 0.012 | 0.02 | 0.96 |
| 1019 | 0.014 | 0.013 | 0.059 | 0.914 |
| 1020 | 0.045 | 0.023 | 0.141 | 0.79 |
| 1021 | 0.015 | 0.015 | 0.104 | 0.867 |
| 1022 | 0.004 | 0.018 | 0.039 | 0.939 |
| 1023 | 0.007 | 0.012 | 0.013 | 0.967 |
| 1024 | 0.007 | 0.006 | 0.016 | 0.971 |
| 1025 | 0.004 | 0.022 | 0.026 | 0.947 |
| 1026 | 0.009 | 0.009 | 0.013 | 0.969 |